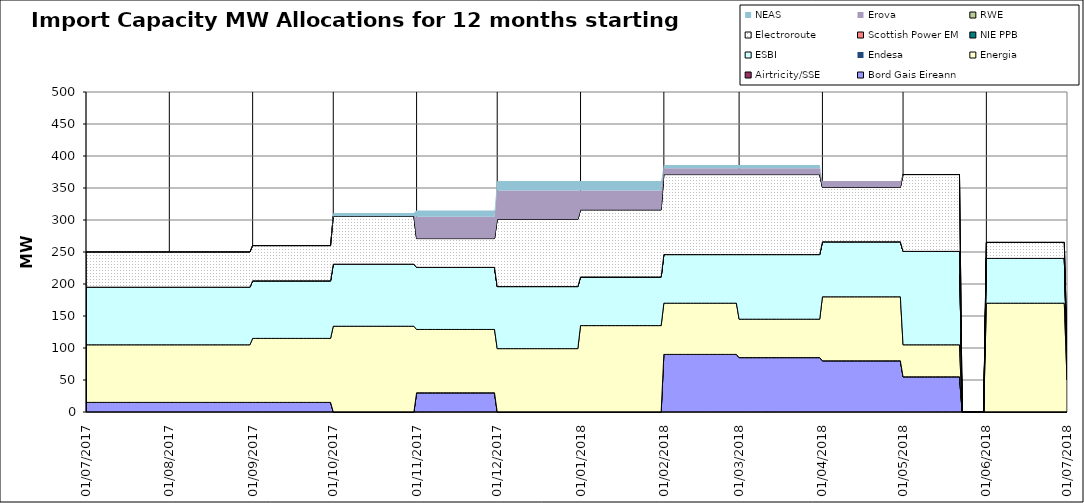
| Category | Bord Gais Eireann | Airtricity/SSE | Energia | Endesa | ESBI | NIE PPB | Scottish Power EM | Electroroute | RWE | Erova | NEAS |
|---|---|---|---|---|---|---|---|---|---|---|---|
| 01/07/2017 | 15 | 0 | 90 | 0 | 90 | 0 | 0 | 55 | 0 | 0 | 0 |
| 02/07/2017 | 15 | 0 | 90 | 0 | 90 | 0 | 0 | 55 | 0 | 0 | 0 |
| 03/07/2017 | 15 | 0 | 90 | 0 | 90 | 0 | 0 | 55 | 0 | 0 | 0 |
| 04/07/2017 | 15 | 0 | 90 | 0 | 90 | 0 | 0 | 55 | 0 | 0 | 0 |
| 05/07/2017 | 15 | 0 | 90 | 0 | 90 | 0 | 0 | 55 | 0 | 0 | 0 |
| 06/07/2017 | 15 | 0 | 90 | 0 | 90 | 0 | 0 | 55 | 0 | 0 | 0 |
| 07/07/2017 | 15 | 0 | 90 | 0 | 90 | 0 | 0 | 55 | 0 | 0 | 0 |
| 08/07/2017 | 15 | 0 | 90 | 0 | 90 | 0 | 0 | 55 | 0 | 0 | 0 |
| 09/07/2017 | 15 | 0 | 90 | 0 | 90 | 0 | 0 | 55 | 0 | 0 | 0 |
| 10/07/2017 | 15 | 0 | 90 | 0 | 90 | 0 | 0 | 55 | 0 | 0 | 0 |
| 11/07/2017 | 15 | 0 | 90 | 0 | 90 | 0 | 0 | 55 | 0 | 0 | 0 |
| 12/07/2017 | 15 | 0 | 90 | 0 | 90 | 0 | 0 | 55 | 0 | 0 | 0 |
| 13/07/2017 | 15 | 0 | 90 | 0 | 90 | 0 | 0 | 55 | 0 | 0 | 0 |
| 14/07/2017 | 15 | 0 | 90 | 0 | 90 | 0 | 0 | 55 | 0 | 0 | 0 |
| 15/07/2017 | 15 | 0 | 90 | 0 | 90 | 0 | 0 | 55 | 0 | 0 | 0 |
| 16/07/2017 | 15 | 0 | 90 | 0 | 90 | 0 | 0 | 55 | 0 | 0 | 0 |
| 17/07/2017 | 15 | 0 | 90 | 0 | 90 | 0 | 0 | 55 | 0 | 0 | 0 |
| 18/07/2017 | 15 | 0 | 90 | 0 | 90 | 0 | 0 | 55 | 0 | 0 | 0 |
| 19/07/2017 | 15 | 0 | 90 | 0 | 90 | 0 | 0 | 55 | 0 | 0 | 0 |
| 20/07/2017 | 15 | 0 | 90 | 0 | 90 | 0 | 0 | 55 | 0 | 0 | 0 |
| 21/07/2017 | 15 | 0 | 90 | 0 | 90 | 0 | 0 | 55 | 0 | 0 | 0 |
| 22/07/2017 | 15 | 0 | 90 | 0 | 90 | 0 | 0 | 55 | 0 | 0 | 0 |
| 23/07/2017 | 15 | 0 | 90 | 0 | 90 | 0 | 0 | 55 | 0 | 0 | 0 |
| 24/07/2017 | 15 | 0 | 90 | 0 | 90 | 0 | 0 | 55 | 0 | 0 | 0 |
| 25/07/2017 | 15 | 0 | 90 | 0 | 90 | 0 | 0 | 55 | 0 | 0 | 0 |
| 26/07/2017 | 15 | 0 | 90 | 0 | 90 | 0 | 0 | 55 | 0 | 0 | 0 |
| 27/07/2017 | 15 | 0 | 90 | 0 | 90 | 0 | 0 | 55 | 0 | 0 | 0 |
| 28/07/2017 | 15 | 0 | 90 | 0 | 90 | 0 | 0 | 55 | 0 | 0 | 0 |
| 29/07/2017 | 15 | 0 | 90 | 0 | 90 | 0 | 0 | 55 | 0 | 0 | 0 |
| 30/07/2017 | 15 | 0 | 90 | 0 | 90 | 0 | 0 | 55 | 0 | 0 | 0 |
| 31/07/2017 | 15 | 0 | 90 | 0 | 90 | 0 | 0 | 55 | 0 | 0 | 0 |
| 01/08/2017 | 15 | 0 | 90 | 0 | 90 | 0 | 0 | 55 | 0 | 0 | 0 |
| 02/08/2017 | 15 | 0 | 90 | 0 | 90 | 0 | 0 | 55 | 0 | 0 | 0 |
| 03/08/2017 | 15 | 0 | 90 | 0 | 90 | 0 | 0 | 55 | 0 | 0 | 0 |
| 04/08/2017 | 15 | 0 | 90 | 0 | 90 | 0 | 0 | 55 | 0 | 0 | 0 |
| 05/08/2017 | 15 | 0 | 90 | 0 | 90 | 0 | 0 | 55 | 0 | 0 | 0 |
| 06/08/2017 | 15 | 0 | 90 | 0 | 90 | 0 | 0 | 55 | 0 | 0 | 0 |
| 07/08/2017 | 15 | 0 | 90 | 0 | 90 | 0 | 0 | 55 | 0 | 0 | 0 |
| 08/08/2017 | 15 | 0 | 90 | 0 | 90 | 0 | 0 | 55 | 0 | 0 | 0 |
| 09/08/2017 | 15 | 0 | 90 | 0 | 90 | 0 | 0 | 55 | 0 | 0 | 0 |
| 10/08/2017 | 15 | 0 | 90 | 0 | 90 | 0 | 0 | 55 | 0 | 0 | 0 |
| 11/08/2017 | 15 | 0 | 90 | 0 | 90 | 0 | 0 | 55 | 0 | 0 | 0 |
| 12/08/2017 | 15 | 0 | 90 | 0 | 90 | 0 | 0 | 55 | 0 | 0 | 0 |
| 13/08/2017 | 15 | 0 | 90 | 0 | 90 | 0 | 0 | 55 | 0 | 0 | 0 |
| 14/08/2017 | 15 | 0 | 90 | 0 | 90 | 0 | 0 | 55 | 0 | 0 | 0 |
| 15/08/2017 | 15 | 0 | 90 | 0 | 90 | 0 | 0 | 55 | 0 | 0 | 0 |
| 16/08/2017 | 15 | 0 | 90 | 0 | 90 | 0 | 0 | 55 | 0 | 0 | 0 |
| 17/08/2017 | 15 | 0 | 90 | 0 | 90 | 0 | 0 | 55 | 0 | 0 | 0 |
| 18/08/2017 | 15 | 0 | 90 | 0 | 90 | 0 | 0 | 55 | 0 | 0 | 0 |
| 19/08/2017 | 15 | 0 | 90 | 0 | 90 | 0 | 0 | 55 | 0 | 0 | 0 |
| 20/08/2017 | 15 | 0 | 90 | 0 | 90 | 0 | 0 | 55 | 0 | 0 | 0 |
| 21/08/2017 | 15 | 0 | 90 | 0 | 90 | 0 | 0 | 55 | 0 | 0 | 0 |
| 22/08/2017 | 15 | 0 | 90 | 0 | 90 | 0 | 0 | 55 | 0 | 0 | 0 |
| 23/08/2017 | 15 | 0 | 90 | 0 | 90 | 0 | 0 | 55 | 0 | 0 | 0 |
| 24/08/2017 | 15 | 0 | 90 | 0 | 90 | 0 | 0 | 55 | 0 | 0 | 0 |
| 25/08/2017 | 15 | 0 | 90 | 0 | 90 | 0 | 0 | 55 | 0 | 0 | 0 |
| 26/08/2017 | 15 | 0 | 90 | 0 | 90 | 0 | 0 | 55 | 0 | 0 | 0 |
| 27/08/2017 | 15 | 0 | 90 | 0 | 90 | 0 | 0 | 55 | 0 | 0 | 0 |
| 28/08/2017 | 15 | 0 | 90 | 0 | 90 | 0 | 0 | 55 | 0 | 0 | 0 |
| 29/08/2017 | 15 | 0 | 90 | 0 | 90 | 0 | 0 | 55 | 0 | 0 | 0 |
| 30/08/2017 | 15 | 0 | 90 | 0 | 90 | 0 | 0 | 55 | 0 | 0 | 0 |
| 31/08/2017 | 15 | 0 | 90 | 0 | 90 | 0 | 0 | 55 | 0 | 0 | 0 |
| 01/09/2017 | 15 | 0 | 100 | 0 | 90 | 0 | 0 | 55 | 0 | 0 | 0 |
| 02/09/2017 | 15 | 0 | 100 | 0 | 90 | 0 | 0 | 55 | 0 | 0 | 0 |
| 03/09/2017 | 15 | 0 | 100 | 0 | 90 | 0 | 0 | 55 | 0 | 0 | 0 |
| 04/09/2017 | 15 | 0 | 100 | 0 | 90 | 0 | 0 | 55 | 0 | 0 | 0 |
| 05/09/2017 | 15 | 0 | 100 | 0 | 90 | 0 | 0 | 55 | 0 | 0 | 0 |
| 06/09/2017 | 15 | 0 | 100 | 0 | 90 | 0 | 0 | 55 | 0 | 0 | 0 |
| 07/09/2017 | 15 | 0 | 100 | 0 | 90 | 0 | 0 | 55 | 0 | 0 | 0 |
| 08/09/2017 | 15 | 0 | 100 | 0 | 90 | 0 | 0 | 55 | 0 | 0 | 0 |
| 09/09/2017 | 15 | 0 | 100 | 0 | 90 | 0 | 0 | 55 | 0 | 0 | 0 |
| 10/09/2017 | 15 | 0 | 100 | 0 | 90 | 0 | 0 | 55 | 0 | 0 | 0 |
| 11/09/2017 | 15 | 0 | 100 | 0 | 90 | 0 | 0 | 55 | 0 | 0 | 0 |
| 12/09/2017 | 15 | 0 | 100 | 0 | 90 | 0 | 0 | 55 | 0 | 0 | 0 |
| 13/09/2017 | 15 | 0 | 100 | 0 | 90 | 0 | 0 | 55 | 0 | 0 | 0 |
| 14/09/2017 | 15 | 0 | 100 | 0 | 90 | 0 | 0 | 55 | 0 | 0 | 0 |
| 15/09/2017 | 15 | 0 | 100 | 0 | 90 | 0 | 0 | 55 | 0 | 0 | 0 |
| 16/09/2017 | 15 | 0 | 100 | 0 | 90 | 0 | 0 | 55 | 0 | 0 | 0 |
| 17/09/2017 | 15 | 0 | 100 | 0 | 90 | 0 | 0 | 55 | 0 | 0 | 0 |
| 18/09/2017 | 15 | 0 | 100 | 0 | 90 | 0 | 0 | 55 | 0 | 0 | 0 |
| 19/09/2017 | 15 | 0 | 100 | 0 | 90 | 0 | 0 | 55 | 0 | 0 | 0 |
| 20/09/2017 | 15 | 0 | 100 | 0 | 90 | 0 | 0 | 55 | 0 | 0 | 0 |
| 21/09/2017 | 15 | 0 | 100 | 0 | 90 | 0 | 0 | 55 | 0 | 0 | 0 |
| 22/09/2017 | 15 | 0 | 100 | 0 | 90 | 0 | 0 | 55 | 0 | 0 | 0 |
| 23/09/2017 | 15 | 0 | 100 | 0 | 90 | 0 | 0 | 55 | 0 | 0 | 0 |
| 24/09/2017 | 15 | 0 | 100 | 0 | 90 | 0 | 0 | 55 | 0 | 0 | 0 |
| 25/09/2017 | 15 | 0 | 100 | 0 | 90 | 0 | 0 | 55 | 0 | 0 | 0 |
| 26/09/2017 | 15 | 0 | 100 | 0 | 90 | 0 | 0 | 55 | 0 | 0 | 0 |
| 27/09/2017 | 15 | 0 | 100 | 0 | 90 | 0 | 0 | 55 | 0 | 0 | 0 |
| 28/09/2017 | 15 | 0 | 100 | 0 | 90 | 0 | 0 | 55 | 0 | 0 | 0 |
| 29/09/2017 | 15 | 0 | 100 | 0 | 90 | 0 | 0 | 55 | 0 | 0 | 0 |
| 30/09/2017 | 15 | 0 | 100 | 0 | 90 | 0 | 0 | 55 | 0 | 0 | 0 |
| 01/10/2017 | 0 | 0 | 134 | 0 | 97 | 0 | 0 | 75 | 0 | 0 | 5 |
| 02/10/2017 | 0 | 0 | 134 | 0 | 97 | 0 | 0 | 75 | 0 | 0 | 5 |
| 03/10/2017 | 0 | 0 | 134 | 0 | 97 | 0 | 0 | 75 | 0 | 0 | 5 |
| 04/10/2017 | 0 | 0 | 134 | 0 | 97 | 0 | 0 | 75 | 0 | 0 | 5 |
| 05/10/2017 | 0 | 0 | 134 | 0 | 97 | 0 | 0 | 75 | 0 | 0 | 5 |
| 06/10/2017 | 0 | 0 | 134 | 0 | 97 | 0 | 0 | 75 | 0 | 0 | 5 |
| 07/10/2017 | 0 | 0 | 134 | 0 | 97 | 0 | 0 | 75 | 0 | 0 | 5 |
| 08/10/2017 | 0 | 0 | 134 | 0 | 97 | 0 | 0 | 75 | 0 | 0 | 5 |
| 09/10/2017 | 0 | 0 | 134 | 0 | 97 | 0 | 0 | 75 | 0 | 0 | 5 |
| 10/10/2017 | 0 | 0 | 134 | 0 | 97 | 0 | 0 | 75 | 0 | 0 | 5 |
| 11/10/2017 | 0 | 0 | 134 | 0 | 97 | 0 | 0 | 75 | 0 | 0 | 5 |
| 12/10/2017 | 0 | 0 | 134 | 0 | 97 | 0 | 0 | 75 | 0 | 0 | 5 |
| 13/10/2017 | 0 | 0 | 134 | 0 | 97 | 0 | 0 | 75 | 0 | 0 | 5 |
| 14/10/2017 | 0 | 0 | 134 | 0 | 97 | 0 | 0 | 75 | 0 | 0 | 5 |
| 15/10/2017 | 0 | 0 | 134 | 0 | 97 | 0 | 0 | 75 | 0 | 0 | 5 |
| 16/10/2017 | 0 | 0 | 134 | 0 | 97 | 0 | 0 | 75 | 0 | 0 | 5 |
| 17/10/2017 | 0 | 0 | 134 | 0 | 97 | 0 | 0 | 75 | 0 | 0 | 5 |
| 18/10/2017 | 0 | 0 | 134 | 0 | 97 | 0 | 0 | 75 | 0 | 0 | 5 |
| 19/10/2017 | 0 | 0 | 134 | 0 | 97 | 0 | 0 | 75 | 0 | 0 | 5 |
| 20/10/2017 | 0 | 0 | 134 | 0 | 97 | 0 | 0 | 75 | 0 | 0 | 5 |
| 21/10/2017 | 0 | 0 | 134 | 0 | 97 | 0 | 0 | 75 | 0 | 0 | 5 |
| 22/10/2017 | 0 | 0 | 134 | 0 | 97 | 0 | 0 | 75 | 0 | 0 | 5 |
| 23/10/2017 | 0 | 0 | 134 | 0 | 97 | 0 | 0 | 75 | 0 | 0 | 5 |
| 24/10/2017 | 0 | 0 | 134 | 0 | 97 | 0 | 0 | 75 | 0 | 0 | 5 |
| 25/10/2017 | 0 | 0 | 134 | 0 | 97 | 0 | 0 | 75 | 0 | 0 | 5 |
| 26/10/2017 | 0 | 0 | 134 | 0 | 97 | 0 | 0 | 75 | 0 | 0 | 5 |
| 27/10/2017 | 0 | 0 | 134 | 0 | 97 | 0 | 0 | 75 | 0 | 0 | 5 |
| 28/10/2017 | 0 | 0 | 134 | 0 | 97 | 0 | 0 | 75 | 0 | 0 | 5 |
| 29/10/2017 | 0 | 0 | 134 | 0 | 97 | 0 | 0 | 75 | 0 | 0 | 5 |
| 30/10/2017 | 0 | 0 | 134 | 0 | 97 | 0 | 0 | 75 | 0 | 0 | 5 |
| 31/10/2017 | 0 | 0 | 134 | 0 | 97 | 0 | 0 | 75 | 0 | 0 | 5 |
| 01/11/2017 | 30 | 0 | 99 | 0 | 97 | 0 | 0 | 45 | 0 | 34 | 10 |
| 02/11/2017 | 30 | 0 | 99 | 0 | 97 | 0 | 0 | 45 | 0 | 34 | 10 |
| 03/11/2017 | 30 | 0 | 99 | 0 | 97 | 0 | 0 | 45 | 0 | 34 | 10 |
| 04/11/2017 | 30 | 0 | 99 | 0 | 97 | 0 | 0 | 45 | 0 | 34 | 10 |
| 05/11/2017 | 30 | 0 | 99 | 0 | 97 | 0 | 0 | 45 | 0 | 34 | 10 |
| 06/11/2017 | 30 | 0 | 99 | 0 | 97 | 0 | 0 | 45 | 0 | 34 | 10 |
| 07/11/2017 | 30 | 0 | 99 | 0 | 97 | 0 | 0 | 45 | 0 | 34 | 10 |
| 08/11/2017 | 30 | 0 | 99 | 0 | 97 | 0 | 0 | 45 | 0 | 34 | 10 |
| 09/11/2017 | 30 | 0 | 99 | 0 | 97 | 0 | 0 | 45 | 0 | 34 | 10 |
| 10/11/2017 | 30 | 0 | 99 | 0 | 97 | 0 | 0 | 45 | 0 | 34 | 10 |
| 11/11/2017 | 30 | 0 | 99 | 0 | 97 | 0 | 0 | 45 | 0 | 34 | 10 |
| 12/11/2017 | 30 | 0 | 99 | 0 | 97 | 0 | 0 | 45 | 0 | 34 | 10 |
| 13/11/2017 | 30 | 0 | 99 | 0 | 97 | 0 | 0 | 45 | 0 | 34 | 10 |
| 14/11/2017 | 30 | 0 | 99 | 0 | 97 | 0 | 0 | 45 | 0 | 34 | 10 |
| 15/11/2017 | 30 | 0 | 99 | 0 | 97 | 0 | 0 | 45 | 0 | 34 | 10 |
| 16/11/2017 | 30 | 0 | 99 | 0 | 97 | 0 | 0 | 45 | 0 | 34 | 10 |
| 17/11/2017 | 30 | 0 | 99 | 0 | 97 | 0 | 0 | 45 | 0 | 34 | 10 |
| 18/11/2017 | 30 | 0 | 99 | 0 | 97 | 0 | 0 | 45 | 0 | 34 | 10 |
| 19/11/2017 | 30 | 0 | 99 | 0 | 97 | 0 | 0 | 45 | 0 | 34 | 10 |
| 20/11/2017 | 30 | 0 | 99 | 0 | 97 | 0 | 0 | 45 | 0 | 34 | 10 |
| 21/11/2017 | 30 | 0 | 99 | 0 | 97 | 0 | 0 | 45 | 0 | 34 | 10 |
| 22/11/2017 | 30 | 0 | 99 | 0 | 97 | 0 | 0 | 45 | 0 | 34 | 10 |
| 23/11/2017 | 30 | 0 | 99 | 0 | 97 | 0 | 0 | 45 | 0 | 34 | 10 |
| 24/11/2017 | 30 | 0 | 99 | 0 | 97 | 0 | 0 | 45 | 0 | 34 | 10 |
| 25/11/2017 | 30 | 0 | 99 | 0 | 97 | 0 | 0 | 45 | 0 | 34 | 10 |
| 26/11/2017 | 30 | 0 | 99 | 0 | 97 | 0 | 0 | 45 | 0 | 34 | 10 |
| 27/11/2017 | 30 | 0 | 99 | 0 | 97 | 0 | 0 | 45 | 0 | 34 | 10 |
| 28/11/2017 | 30 | 0 | 99 | 0 | 97 | 0 | 0 | 45 | 0 | 34 | 10 |
| 29/11/2017 | 30 | 0 | 99 | 0 | 97 | 0 | 0 | 45 | 0 | 34 | 10 |
| 30/11/2017 | 30 | 0 | 99 | 0 | 97 | 0 | 0 | 45 | 0 | 34 | 10 |
| 01/12/2017 | 0 | 0 | 99 | 0 | 97 | 0 | 0 | 105 | 0 | 45 | 15 |
| 02/12/2017 | 0 | 0 | 99 | 0 | 97 | 0 | 0 | 105 | 0 | 45 | 15 |
| 03/12/2017 | 0 | 0 | 99 | 0 | 97 | 0 | 0 | 105 | 0 | 45 | 15 |
| 04/12/2017 | 0 | 0 | 99 | 0 | 97 | 0 | 0 | 105 | 0 | 45 | 15 |
| 05/12/2017 | 0 | 0 | 99 | 0 | 97 | 0 | 0 | 105 | 0 | 45 | 15 |
| 06/12/2017 | 0 | 0 | 99 | 0 | 97 | 0 | 0 | 105 | 0 | 45 | 15 |
| 07/12/2017 | 0 | 0 | 99 | 0 | 97 | 0 | 0 | 105 | 0 | 45 | 15 |
| 08/12/2017 | 0 | 0 | 99 | 0 | 97 | 0 | 0 | 105 | 0 | 45 | 15 |
| 09/12/2017 | 0 | 0 | 99 | 0 | 97 | 0 | 0 | 105 | 0 | 45 | 15 |
| 10/12/2017 | 0 | 0 | 99 | 0 | 97 | 0 | 0 | 105 | 0 | 45 | 15 |
| 11/12/2017 | 0 | 0 | 99 | 0 | 97 | 0 | 0 | 105 | 0 | 45 | 15 |
| 12/12/2017 | 0 | 0 | 99 | 0 | 97 | 0 | 0 | 105 | 0 | 45 | 15 |
| 13/12/2017 | 0 | 0 | 99 | 0 | 97 | 0 | 0 | 105 | 0 | 45 | 15 |
| 14/12/2017 | 0 | 0 | 99 | 0 | 97 | 0 | 0 | 105 | 0 | 45 | 15 |
| 15/12/2017 | 0 | 0 | 99 | 0 | 97 | 0 | 0 | 105 | 0 | 45 | 15 |
| 16/12/2017 | 0 | 0 | 99 | 0 | 97 | 0 | 0 | 105 | 0 | 45 | 15 |
| 17/12/2017 | 0 | 0 | 99 | 0 | 97 | 0 | 0 | 105 | 0 | 45 | 15 |
| 18/12/2017 | 0 | 0 | 99 | 0 | 97 | 0 | 0 | 105 | 0 | 45 | 15 |
| 19/12/2017 | 0 | 0 | 99 | 0 | 97 | 0 | 0 | 105 | 0 | 45 | 15 |
| 20/12/2017 | 0 | 0 | 99 | 0 | 97 | 0 | 0 | 105 | 0 | 45 | 15 |
| 21/12/2017 | 0 | 0 | 99 | 0 | 97 | 0 | 0 | 105 | 0 | 45 | 15 |
| 22/12/2017 | 0 | 0 | 99 | 0 | 97 | 0 | 0 | 105 | 0 | 45 | 15 |
| 23/12/2017 | 0 | 0 | 99 | 0 | 97 | 0 | 0 | 105 | 0 | 45 | 15 |
| 24/12/2017 | 0 | 0 | 99 | 0 | 97 | 0 | 0 | 105 | 0 | 45 | 15 |
| 25/12/2017 | 0 | 0 | 99 | 0 | 97 | 0 | 0 | 105 | 0 | 45 | 15 |
| 26/12/2017 | 0 | 0 | 99 | 0 | 97 | 0 | 0 | 105 | 0 | 45 | 15 |
| 27/12/2017 | 0 | 0 | 99 | 0 | 97 | 0 | 0 | 105 | 0 | 45 | 15 |
| 28/12/2017 | 0 | 0 | 99 | 0 | 97 | 0 | 0 | 105 | 0 | 45 | 15 |
| 29/12/2017 | 0 | 0 | 99 | 0 | 97 | 0 | 0 | 105 | 0 | 45 | 15 |
| 30/12/2017 | 0 | 0 | 99 | 0 | 97 | 0 | 0 | 105 | 0 | 45 | 15 |
| 31/12/2017 | 0 | 0 | 99 | 0 | 97 | 0 | 0 | 105 | 0 | 45 | 15 |
| 01/01/2018 | 0 | 0 | 135 | 0 | 76 | 0 | 0 | 105 | 0 | 30 | 15 |
| 02/01/2018 | 0 | 0 | 135 | 0 | 76 | 0 | 0 | 105 | 0 | 30 | 15 |
| 03/01/2018 | 0 | 0 | 135 | 0 | 76 | 0 | 0 | 105 | 0 | 30 | 15 |
| 04/01/2018 | 0 | 0 | 135 | 0 | 76 | 0 | 0 | 105 | 0 | 30 | 15 |
| 05/01/2018 | 0 | 0 | 135 | 0 | 76 | 0 | 0 | 105 | 0 | 30 | 15 |
| 06/01/2018 | 0 | 0 | 135 | 0 | 76 | 0 | 0 | 105 | 0 | 30 | 15 |
| 07/01/2018 | 0 | 0 | 135 | 0 | 76 | 0 | 0 | 105 | 0 | 30 | 15 |
| 08/01/2018 | 0 | 0 | 135 | 0 | 76 | 0 | 0 | 105 | 0 | 30 | 15 |
| 09/01/2018 | 0 | 0 | 135 | 0 | 76 | 0 | 0 | 105 | 0 | 30 | 15 |
| 10/01/2018 | 0 | 0 | 135 | 0 | 76 | 0 | 0 | 105 | 0 | 30 | 15 |
| 11/01/2018 | 0 | 0 | 135 | 0 | 76 | 0 | 0 | 105 | 0 | 30 | 15 |
| 12/01/2018 | 0 | 0 | 135 | 0 | 76 | 0 | 0 | 105 | 0 | 30 | 15 |
| 13/01/2018 | 0 | 0 | 135 | 0 | 76 | 0 | 0 | 105 | 0 | 30 | 15 |
| 14/01/2018 | 0 | 0 | 135 | 0 | 76 | 0 | 0 | 105 | 0 | 30 | 15 |
| 15/01/2018 | 0 | 0 | 135 | 0 | 76 | 0 | 0 | 105 | 0 | 30 | 15 |
| 16/01/2018 | 0 | 0 | 135 | 0 | 76 | 0 | 0 | 105 | 0 | 30 | 15 |
| 17/01/2018 | 0 | 0 | 135 | 0 | 76 | 0 | 0 | 105 | 0 | 30 | 15 |
| 18/01/2018 | 0 | 0 | 135 | 0 | 76 | 0 | 0 | 105 | 0 | 30 | 15 |
| 19/01/2018 | 0 | 0 | 135 | 0 | 76 | 0 | 0 | 105 | 0 | 30 | 15 |
| 20/01/2018 | 0 | 0 | 135 | 0 | 76 | 0 | 0 | 105 | 0 | 30 | 15 |
| 21/01/2018 | 0 | 0 | 135 | 0 | 76 | 0 | 0 | 105 | 0 | 30 | 15 |
| 22/01/2018 | 0 | 0 | 135 | 0 | 76 | 0 | 0 | 105 | 0 | 30 | 15 |
| 23/01/2018 | 0 | 0 | 135 | 0 | 76 | 0 | 0 | 105 | 0 | 30 | 15 |
| 24/01/2018 | 0 | 0 | 135 | 0 | 76 | 0 | 0 | 105 | 0 | 30 | 15 |
| 25/01/2018 | 0 | 0 | 135 | 0 | 76 | 0 | 0 | 105 | 0 | 30 | 15 |
| 26/01/2018 | 0 | 0 | 135 | 0 | 76 | 0 | 0 | 105 | 0 | 30 | 15 |
| 27/01/2018 | 0 | 0 | 135 | 0 | 76 | 0 | 0 | 105 | 0 | 30 | 15 |
| 28/01/2018 | 0 | 0 | 135 | 0 | 76 | 0 | 0 | 105 | 0 | 30 | 15 |
| 29/01/2018 | 0 | 0 | 135 | 0 | 76 | 0 | 0 | 105 | 0 | 30 | 15 |
| 30/01/2018 | 0 | 0 | 135 | 0 | 76 | 0 | 0 | 105 | 0 | 30 | 15 |
| 31/01/2018 | 0 | 0 | 135 | 0 | 76 | 0 | 0 | 105 | 0 | 30 | 15 |
| 01/02/2018 | 90 | 0 | 80 | 0 | 76 | 0 | 0 | 125 | 0 | 10 | 5 |
| 02/02/2018 | 90 | 0 | 80 | 0 | 76 | 0 | 0 | 125 | 0 | 10 | 5 |
| 03/02/2018 | 90 | 0 | 80 | 0 | 76 | 0 | 0 | 125 | 0 | 10 | 5 |
| 04/02/2018 | 90 | 0 | 80 | 0 | 76 | 0 | 0 | 125 | 0 | 10 | 5 |
| 05/02/2018 | 90 | 0 | 80 | 0 | 76 | 0 | 0 | 125 | 0 | 10 | 5 |
| 06/02/2018 | 90 | 0 | 80 | 0 | 76 | 0 | 0 | 125 | 0 | 10 | 5 |
| 07/02/2018 | 90 | 0 | 80 | 0 | 76 | 0 | 0 | 125 | 0 | 10 | 5 |
| 08/02/2018 | 90 | 0 | 80 | 0 | 76 | 0 | 0 | 125 | 0 | 10 | 5 |
| 09/02/2018 | 90 | 0 | 80 | 0 | 76 | 0 | 0 | 125 | 0 | 10 | 5 |
| 10/02/2018 | 90 | 0 | 80 | 0 | 76 | 0 | 0 | 125 | 0 | 10 | 5 |
| 11/02/2018 | 90 | 0 | 80 | 0 | 76 | 0 | 0 | 125 | 0 | 10 | 5 |
| 12/02/2018 | 90 | 0 | 80 | 0 | 76 | 0 | 0 | 125 | 0 | 10 | 5 |
| 13/02/2018 | 90 | 0 | 80 | 0 | 76 | 0 | 0 | 125 | 0 | 10 | 5 |
| 14/02/2018 | 90 | 0 | 80 | 0 | 76 | 0 | 0 | 125 | 0 | 10 | 5 |
| 15/02/2018 | 90 | 0 | 80 | 0 | 76 | 0 | 0 | 125 | 0 | 10 | 5 |
| 16/02/2018 | 90 | 0 | 80 | 0 | 76 | 0 | 0 | 125 | 0 | 10 | 5 |
| 17/02/2018 | 90 | 0 | 80 | 0 | 76 | 0 | 0 | 125 | 0 | 10 | 5 |
| 18/02/2018 | 90 | 0 | 80 | 0 | 76 | 0 | 0 | 125 | 0 | 10 | 5 |
| 19/02/2018 | 90 | 0 | 80 | 0 | 76 | 0 | 0 | 125 | 0 | 10 | 5 |
| 20/02/2018 | 90 | 0 | 80 | 0 | 76 | 0 | 0 | 125 | 0 | 10 | 5 |
| 21/02/2018 | 90 | 0 | 80 | 0 | 76 | 0 | 0 | 125 | 0 | 10 | 5 |
| 22/02/2018 | 90 | 0 | 80 | 0 | 76 | 0 | 0 | 125 | 0 | 10 | 5 |
| 23/02/2018 | 90 | 0 | 80 | 0 | 76 | 0 | 0 | 125 | 0 | 10 | 5 |
| 24/02/2018 | 90 | 0 | 80 | 0 | 76 | 0 | 0 | 125 | 0 | 10 | 5 |
| 25/02/2018 | 90 | 0 | 80 | 0 | 76 | 0 | 0 | 125 | 0 | 10 | 5 |
| 26/02/2018 | 90 | 0 | 80 | 0 | 76 | 0 | 0 | 125 | 0 | 10 | 5 |
| 27/02/2018 | 90 | 0 | 80 | 0 | 76 | 0 | 0 | 125 | 0 | 10 | 5 |
| 28/02/2018 | 90 | 0 | 80 | 0 | 76 | 0 | 0 | 125 | 0 | 10 | 5 |
| 01/03/2018 | 85 | 0 | 60 | 0 | 101 | 0 | 0 | 125 | 0 | 10 | 5 |
| 02/03/2018 | 85 | 0 | 60 | 0 | 101 | 0 | 0 | 125 | 0 | 10 | 5 |
| 03/03/2018 | 85 | 0 | 60 | 0 | 101 | 0 | 0 | 125 | 0 | 10 | 5 |
| 04/03/2018 | 85 | 0 | 60 | 0 | 101 | 0 | 0 | 125 | 0 | 10 | 5 |
| 05/03/2018 | 85 | 0 | 60 | 0 | 101 | 0 | 0 | 125 | 0 | 10 | 5 |
| 06/03/2018 | 85 | 0 | 60 | 0 | 101 | 0 | 0 | 125 | 0 | 10 | 5 |
| 07/03/2018 | 85 | 0 | 60 | 0 | 101 | 0 | 0 | 125 | 0 | 10 | 5 |
| 08/03/2018 | 85 | 0 | 60 | 0 | 101 | 0 | 0 | 125 | 0 | 10 | 5 |
| 09/03/2018 | 85 | 0 | 60 | 0 | 101 | 0 | 0 | 125 | 0 | 10 | 5 |
| 10/03/2018 | 85 | 0 | 60 | 0 | 101 | 0 | 0 | 125 | 0 | 10 | 5 |
| 11/03/2018 | 85 | 0 | 60 | 0 | 101 | 0 | 0 | 125 | 0 | 10 | 5 |
| 12/03/2018 | 85 | 0 | 60 | 0 | 101 | 0 | 0 | 125 | 0 | 10 | 5 |
| 13/03/2018 | 85 | 0 | 60 | 0 | 101 | 0 | 0 | 125 | 0 | 10 | 5 |
| 14/03/2018 | 85 | 0 | 60 | 0 | 101 | 0 | 0 | 125 | 0 | 10 | 5 |
| 15/03/2018 | 85 | 0 | 60 | 0 | 101 | 0 | 0 | 125 | 0 | 10 | 5 |
| 16/03/2018 | 85 | 0 | 60 | 0 | 101 | 0 | 0 | 125 | 0 | 10 | 5 |
| 17/03/2018 | 85 | 0 | 60 | 0 | 101 | 0 | 0 | 125 | 0 | 10 | 5 |
| 18/03/2018 | 85 | 0 | 60 | 0 | 101 | 0 | 0 | 125 | 0 | 10 | 5 |
| 19/03/2018 | 85 | 0 | 60 | 0 | 101 | 0 | 0 | 125 | 0 | 10 | 5 |
| 20/03/2018 | 85 | 0 | 60 | 0 | 101 | 0 | 0 | 125 | 0 | 10 | 5 |
| 21/03/2018 | 85 | 0 | 60 | 0 | 101 | 0 | 0 | 125 | 0 | 10 | 5 |
| 22/03/2018 | 85 | 0 | 60 | 0 | 101 | 0 | 0 | 125 | 0 | 10 | 5 |
| 23/03/2018 | 85 | 0 | 60 | 0 | 101 | 0 | 0 | 125 | 0 | 10 | 5 |
| 24/03/2018 | 85 | 0 | 60 | 0 | 101 | 0 | 0 | 125 | 0 | 10 | 5 |
| 25/03/2018 | 85 | 0 | 60 | 0 | 101 | 0 | 0 | 125 | 0 | 10 | 5 |
| 26/03/2018 | 85 | 0 | 60 | 0 | 101 | 0 | 0 | 125 | 0 | 10 | 5 |
| 27/03/2018 | 85 | 0 | 60 | 0 | 101 | 0 | 0 | 125 | 0 | 10 | 5 |
| 28/03/2018 | 85 | 0 | 60 | 0 | 101 | 0 | 0 | 125 | 0 | 10 | 5 |
| 29/03/2018 | 85 | 0 | 60 | 0 | 101 | 0 | 0 | 125 | 0 | 10 | 5 |
| 30/03/2018 | 85 | 0 | 60 | 0 | 101 | 0 | 0 | 125 | 0 | 10 | 5 |
| 31/03/2018 | 85 | 0 | 60 | 0 | 101 | 0 | 0 | 125 | 0 | 10 | 5 |
| 01/04/2018 | 80 | 0 | 100 | 0 | 86 | 0 | 0 | 85 | 0 | 10 | 0 |
| 02/04/2018 | 80 | 0 | 100 | 0 | 86 | 0 | 0 | 85 | 0 | 10 | 0 |
| 03/04/2018 | 80 | 0 | 100 | 0 | 86 | 0 | 0 | 85 | 0 | 10 | 0 |
| 04/04/2018 | 80 | 0 | 100 | 0 | 86 | 0 | 0 | 85 | 0 | 10 | 0 |
| 05/04/2018 | 80 | 0 | 100 | 0 | 86 | 0 | 0 | 85 | 0 | 10 | 0 |
| 06/04/2018 | 80 | 0 | 100 | 0 | 86 | 0 | 0 | 85 | 0 | 10 | 0 |
| 07/04/2018 | 80 | 0 | 100 | 0 | 86 | 0 | 0 | 85 | 0 | 10 | 0 |
| 08/04/2018 | 80 | 0 | 100 | 0 | 86 | 0 | 0 | 85 | 0 | 10 | 0 |
| 09/04/2018 | 80 | 0 | 100 | 0 | 86 | 0 | 0 | 85 | 0 | 10 | 0 |
| 10/04/2018 | 80 | 0 | 100 | 0 | 86 | 0 | 0 | 85 | 0 | 10 | 0 |
| 11/04/2018 | 80 | 0 | 100 | 0 | 86 | 0 | 0 | 85 | 0 | 10 | 0 |
| 12/04/2018 | 80 | 0 | 100 | 0 | 86 | 0 | 0 | 85 | 0 | 10 | 0 |
| 13/04/2018 | 80 | 0 | 100 | 0 | 86 | 0 | 0 | 85 | 0 | 10 | 0 |
| 14/04/2018 | 80 | 0 | 100 | 0 | 86 | 0 | 0 | 85 | 0 | 10 | 0 |
| 15/04/2018 | 80 | 0 | 100 | 0 | 86 | 0 | 0 | 85 | 0 | 10 | 0 |
| 16/04/2018 | 80 | 0 | 100 | 0 | 86 | 0 | 0 | 85 | 0 | 10 | 0 |
| 17/04/2018 | 80 | 0 | 100 | 0 | 86 | 0 | 0 | 85 | 0 | 10 | 0 |
| 18/04/2018 | 80 | 0 | 100 | 0 | 86 | 0 | 0 | 85 | 0 | 10 | 0 |
| 19/04/2018 | 80 | 0 | 100 | 0 | 86 | 0 | 0 | 85 | 0 | 10 | 0 |
| 20/04/2018 | 80 | 0 | 100 | 0 | 86 | 0 | 0 | 85 | 0 | 10 | 0 |
| 21/04/2018 | 80 | 0 | 100 | 0 | 86 | 0 | 0 | 85 | 0 | 10 | 0 |
| 22/04/2018 | 80 | 0 | 100 | 0 | 86 | 0 | 0 | 85 | 0 | 10 | 0 |
| 23/04/2018 | 80 | 0 | 100 | 0 | 86 | 0 | 0 | 85 | 0 | 10 | 0 |
| 24/04/2018 | 80 | 0 | 100 | 0 | 86 | 0 | 0 | 85 | 0 | 10 | 0 |
| 25/04/2018 | 80 | 0 | 100 | 0 | 86 | 0 | 0 | 85 | 0 | 10 | 0 |
| 26/04/2018 | 80 | 0 | 100 | 0 | 86 | 0 | 0 | 85 | 0 | 10 | 0 |
| 27/04/2018 | 80 | 0 | 100 | 0 | 86 | 0 | 0 | 85 | 0 | 10 | 0 |
| 28/04/2018 | 80 | 0 | 100 | 0 | 86 | 0 | 0 | 85 | 0 | 10 | 0 |
| 29/04/2018 | 80 | 0 | 100 | 0 | 86 | 0 | 0 | 85 | 0 | 10 | 0 |
| 30/04/2018 | 80 | 0 | 100 | 0 | 86 | 0 | 0 | 85 | 0 | 10 | 0 |
| 01/05/2018 | 55 | 0 | 50 | 0 | 146 | 0 | 0 | 120 | 0 | 0 | 0 |
| 02/05/2018 | 55 | 0 | 50 | 0 | 146 | 0 | 0 | 120 | 0 | 0 | 0 |
| 03/05/2018 | 55 | 0 | 50 | 0 | 146 | 0 | 0 | 120 | 0 | 0 | 0 |
| 04/05/2018 | 55 | 0 | 50 | 0 | 146 | 0 | 0 | 120 | 0 | 0 | 0 |
| 05/05/2018 | 55 | 0 | 50 | 0 | 146 | 0 | 0 | 120 | 0 | 0 | 0 |
| 06/05/2018 | 55 | 0 | 50 | 0 | 146 | 0 | 0 | 120 | 0 | 0 | 0 |
| 07/05/2018 | 55 | 0 | 50 | 0 | 146 | 0 | 0 | 120 | 0 | 0 | 0 |
| 08/05/2018 | 55 | 0 | 50 | 0 | 146 | 0 | 0 | 120 | 0 | 0 | 0 |
| 09/05/2018 | 55 | 0 | 50 | 0 | 146 | 0 | 0 | 120 | 0 | 0 | 0 |
| 10/05/2018 | 55 | 0 | 50 | 0 | 146 | 0 | 0 | 120 | 0 | 0 | 0 |
| 11/05/2018 | 55 | 0 | 50 | 0 | 146 | 0 | 0 | 120 | 0 | 0 | 0 |
| 12/05/2018 | 55 | 0 | 50 | 0 | 146 | 0 | 0 | 120 | 0 | 0 | 0 |
| 13/05/2018 | 55 | 0 | 50 | 0 | 146 | 0 | 0 | 120 | 0 | 0 | 0 |
| 14/05/2018 | 55 | 0 | 50 | 0 | 146 | 0 | 0 | 120 | 0 | 0 | 0 |
| 15/05/2018 | 55 | 0 | 50 | 0 | 146 | 0 | 0 | 120 | 0 | 0 | 0 |
| 16/05/2018 | 55 | 0 | 50 | 0 | 146 | 0 | 0 | 120 | 0 | 0 | 0 |
| 17/05/2018 | 55 | 0 | 50 | 0 | 146 | 0 | 0 | 120 | 0 | 0 | 0 |
| 18/05/2018 | 55 | 0 | 50 | 0 | 146 | 0 | 0 | 120 | 0 | 0 | 0 |
| 19/05/2018 | 55 | 0 | 50 | 0 | 146 | 0 | 0 | 120 | 0 | 0 | 0 |
| 20/05/2018 | 55 | 0 | 50 | 0 | 146 | 0 | 0 | 120 | 0 | 0 | 0 |
| 21/05/2018 | 55 | 0 | 50 | 0 | 146 | 0 | 0 | 120 | 0 | 0 | 0 |
| 22/05/2018 | 55 | 0 | 50 | 0 | 146 | 0 | 0 | 120 | 0 | 0 | 0 |
| 23/05/2018 | 0 | 0 | 0 | 0 | 0 | 0 | 0 | 0 | 0 | 0 | 0 |
| 24/05/2018 | 0 | 0 | 0 | 0 | 0 | 0 | 0 | 0 | 0 | 0 | 0 |
| 25/05/2018 | 0 | 0 | 0 | 0 | 0 | 0 | 0 | 0 | 0 | 0 | 0 |
| 26/05/2018 | 0 | 0 | 0 | 0 | 0 | 0 | 0 | 0 | 0 | 0 | 0 |
| 27/05/2018 | 0 | 0 | 0 | 0 | 0 | 0 | 0 | 0 | 0 | 0 | 0 |
| 28/05/2018 | 0 | 0 | 0 | 0 | 0 | 0 | 0 | 0 | 0 | 0 | 0 |
| 29/05/2018 | 0 | 0 | 0 | 0 | 0 | 0 | 0 | 0 | 0 | 0 | 0 |
| 30/05/2018 | 0 | 0 | 0 | 0 | 0 | 0 | 0 | 0 | 0 | 0 | 0 |
| 31/05/2018 | 0 | 0 | 0 | 0 | 0 | 0 | 0 | 0 | 0 | 0 | 0 |
| 01/06/2018 | 0 | 0 | 170 | 0 | 70 | 0 | 0 | 25 | 0 | 0 | 0 |
| 02/06/2018 | 0 | 0 | 170 | 0 | 70 | 0 | 0 | 25 | 0 | 0 | 0 |
| 03/06/2018 | 0 | 0 | 170 | 0 | 70 | 0 | 0 | 25 | 0 | 0 | 0 |
| 04/06/2018 | 0 | 0 | 170 | 0 | 70 | 0 | 0 | 25 | 0 | 0 | 0 |
| 05/06/2018 | 0 | 0 | 170 | 0 | 70 | 0 | 0 | 25 | 0 | 0 | 0 |
| 06/06/2018 | 0 | 0 | 170 | 0 | 70 | 0 | 0 | 25 | 0 | 0 | 0 |
| 07/06/2018 | 0 | 0 | 170 | 0 | 70 | 0 | 0 | 25 | 0 | 0 | 0 |
| 08/06/2018 | 0 | 0 | 170 | 0 | 70 | 0 | 0 | 25 | 0 | 0 | 0 |
| 09/06/2018 | 0 | 0 | 170 | 0 | 70 | 0 | 0 | 25 | 0 | 0 | 0 |
| 10/06/2018 | 0 | 0 | 170 | 0 | 70 | 0 | 0 | 25 | 0 | 0 | 0 |
| 11/06/2018 | 0 | 0 | 170 | 0 | 70 | 0 | 0 | 25 | 0 | 0 | 0 |
| 12/06/2018 | 0 | 0 | 170 | 0 | 70 | 0 | 0 | 25 | 0 | 0 | 0 |
| 13/06/2018 | 0 | 0 | 170 | 0 | 70 | 0 | 0 | 25 | 0 | 0 | 0 |
| 14/06/2018 | 0 | 0 | 170 | 0 | 70 | 0 | 0 | 25 | 0 | 0 | 0 |
| 15/06/2018 | 0 | 0 | 170 | 0 | 70 | 0 | 0 | 25 | 0 | 0 | 0 |
| 16/06/2018 | 0 | 0 | 170 | 0 | 70 | 0 | 0 | 25 | 0 | 0 | 0 |
| 17/06/2018 | 0 | 0 | 170 | 0 | 70 | 0 | 0 | 25 | 0 | 0 | 0 |
| 18/06/2018 | 0 | 0 | 170 | 0 | 70 | 0 | 0 | 25 | 0 | 0 | 0 |
| 19/06/2018 | 0 | 0 | 170 | 0 | 70 | 0 | 0 | 25 | 0 | 0 | 0 |
| 20/06/2018 | 0 | 0 | 170 | 0 | 70 | 0 | 0 | 25 | 0 | 0 | 0 |
| 21/06/2018 | 0 | 0 | 170 | 0 | 70 | 0 | 0 | 25 | 0 | 0 | 0 |
| 22/06/2018 | 0 | 0 | 170 | 0 | 70 | 0 | 0 | 25 | 0 | 0 | 0 |
| 23/06/2018 | 0 | 0 | 170 | 0 | 70 | 0 | 0 | 25 | 0 | 0 | 0 |
| 24/06/2018 | 0 | 0 | 170 | 0 | 70 | 0 | 0 | 25 | 0 | 0 | 0 |
| 25/06/2018 | 0 | 0 | 170 | 0 | 70 | 0 | 0 | 25 | 0 | 0 | 0 |
| 26/06/2018 | 0 | 0 | 170 | 0 | 70 | 0 | 0 | 25 | 0 | 0 | 0 |
| 27/06/2018 | 0 | 0 | 170 | 0 | 70 | 0 | 0 | 25 | 0 | 0 | 0 |
| 28/06/2018 | 0 | 0 | 170 | 0 | 70 | 0 | 0 | 25 | 0 | 0 | 0 |
| 29/06/2018 | 0 | 0 | 170 | 0 | 70 | 0 | 0 | 25 | 0 | 0 | 0 |
| 30/06/2018 | 0 | 0 | 170 | 0 | 70 | 0 | 0 | 25 | 0 | 0 | 0 |
| 01/07/2018 | 0 | 0 | 50 | 0 | 30 | 0 | 0 | 20 | 0 | 0 | 0 |